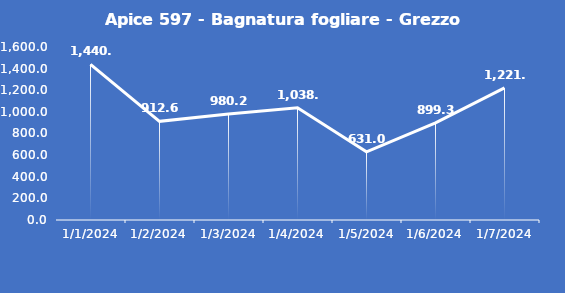
| Category | Apice 597 - Bagnatura fogliare - Grezzo (min) |
|---|---|
| 1/1/24 | 1440 |
| 1/2/24 | 912.6 |
| 1/3/24 | 980.2 |
| 1/4/24 | 1038.5 |
| 1/5/24 | 631 |
| 1/6/24 | 899.3 |
| 1/7/24 | 1221.8 |